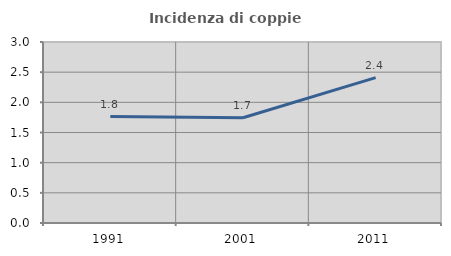
| Category | Incidenza di coppie miste |
|---|---|
| 1991.0 | 1.765 |
| 2001.0 | 1.744 |
| 2011.0 | 2.41 |